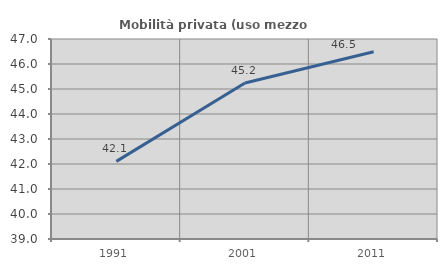
| Category | Mobilità privata (uso mezzo privato) |
|---|---|
| 1991.0 | 42.105 |
| 2001.0 | 45.238 |
| 2011.0 | 46.491 |